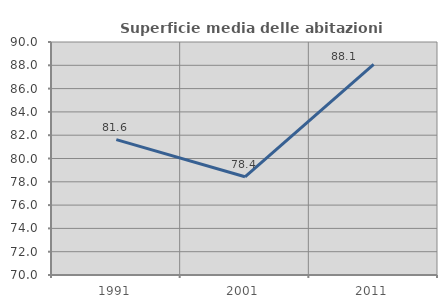
| Category | Superficie media delle abitazioni occupate |
|---|---|
| 1991.0 | 81.62 |
| 2001.0 | 78.432 |
| 2011.0 | 88.078 |